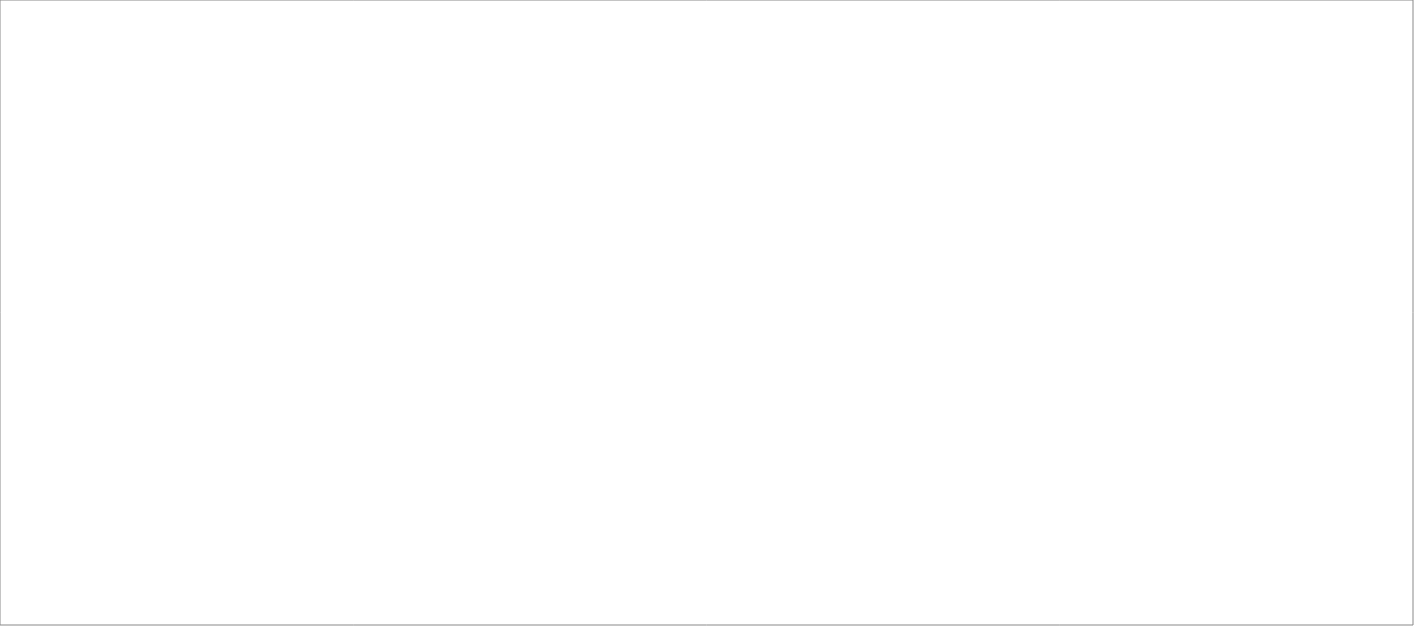
| Category | Total |
|---|---|
| Poolia Sverige AB | 85 |
| AB Effektiv Borås AB | 82.5 |
| Randstad AB | 80 |
| Wise Professionals AB | 65 |
| Experis AB | 45 |